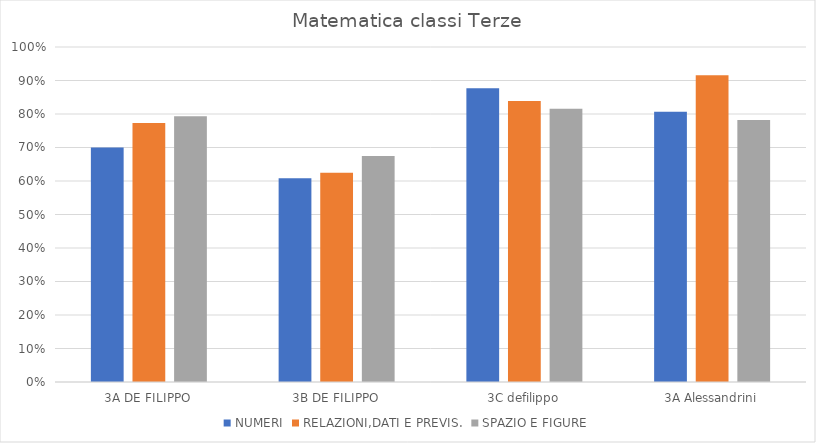
| Category | NUMERI | RELAZIONI,DATI E PREVIS. | SPAZIO E FIGURE |
|---|---|---|---|
| 3A DE FILIPPO | 0.7 | 0.773 | 0.793 |
| 3B DE FILIPPO | 0.608 | 0.625 | 0.675 |
| 3C defilippo | 0.877 | 0.838 | 0.815 |
| 3A Alessandrini | 0.806 | 0.916 | 0.782 |